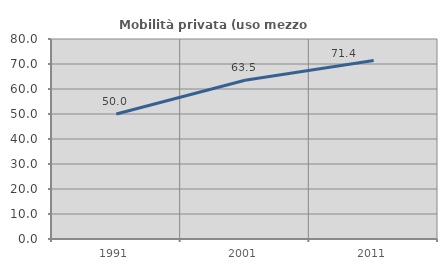
| Category | Mobilità privata (uso mezzo privato) |
|---|---|
| 1991.0 | 49.982 |
| 2001.0 | 63.503 |
| 2011.0 | 71.4 |